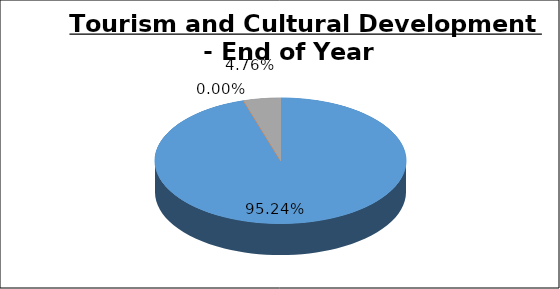
| Category | Q4 |
|---|---|
| Green | 0.952 |
| Amber | 0 |
| Red | 0.048 |